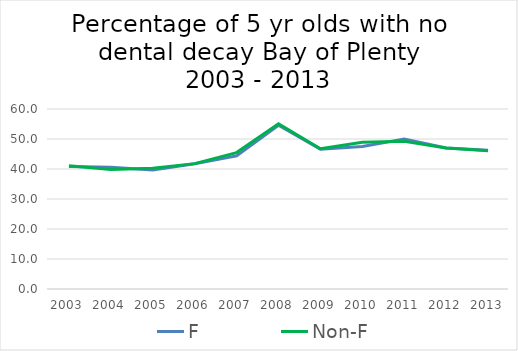
| Category | F | Non-F |
|---|---|---|
| 2003.0 | 40.8 | 41.09 |
| 2004.0 | 40.58 | 39.85 |
| 2005.0 | 39.695 | 40.226 |
| 2006.0 | 41.73 | 41.79 |
| 2007.0 | 44.383 | 45.466 |
| 2008.0 | 54.572 | 55.041 |
| 2009.0 | 46.611 | 46.761 |
| 2010.0 | 47.483 | 48.923 |
| 2011.0 | 50.03 | 49.241 |
| 2012.0 | 47.017 | 46.979 |
| 2013.0 | 46.28 | 46.101 |